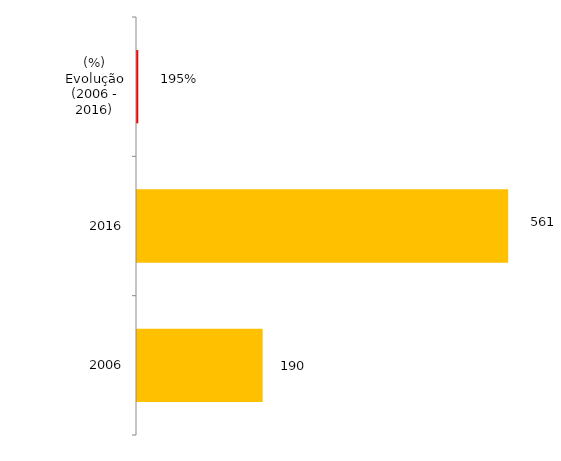
| Category | Docente - Efetivo |
|---|---|
| 2006 | 190 |
| 2016 | 561 |
| (%) Evolução (2006 - 2016) | 1.953 |